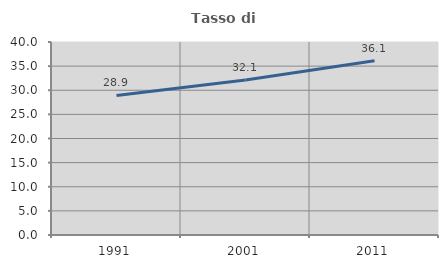
| Category | Tasso di occupazione   |
|---|---|
| 1991.0 | 28.915 |
| 2001.0 | 32.14 |
| 2011.0 | 36.102 |